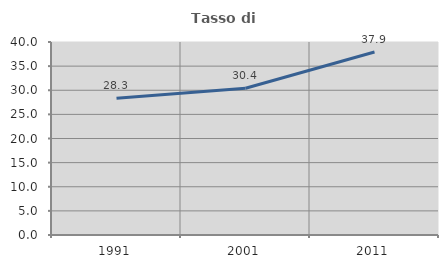
| Category | Tasso di occupazione   |
|---|---|
| 1991.0 | 28.327 |
| 2001.0 | 30.408 |
| 2011.0 | 37.934 |